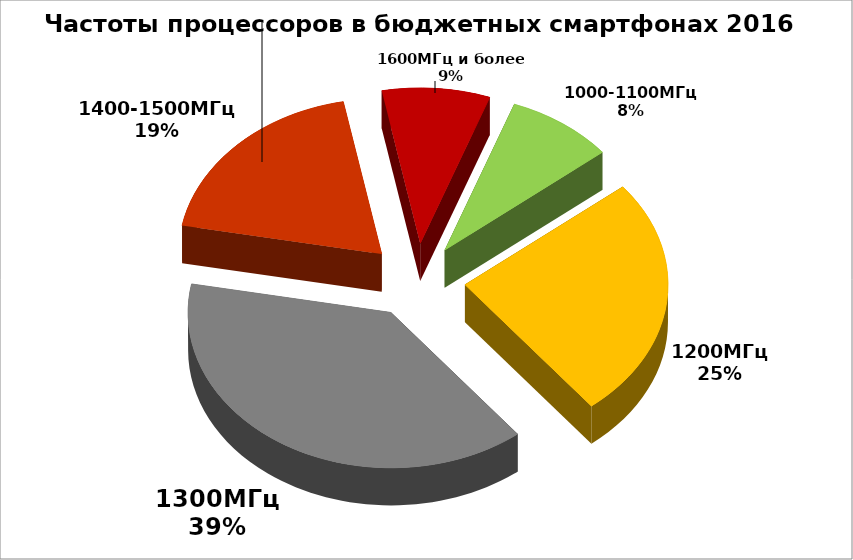
| Category | Series 0 |
|---|---|
| 1000-1100МГц | 14 |
| 1200МГц | 41 |
| 1300МГц | 63 |
| 1400-1500МГц | 31 |
| 1600МГц и более | 14 |